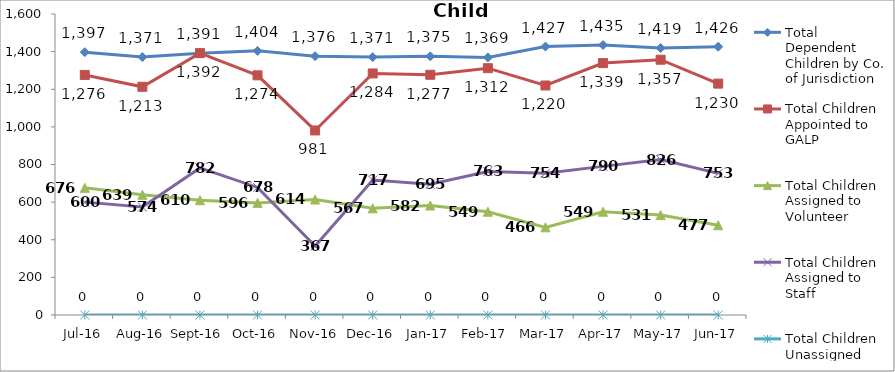
| Category | Total Dependent Children by Co. of Jurisdiction | Total Children Appointed to GALP | Total Children Assigned to Volunteer | Total Children Assigned to Staff | Total Children Unassigned |
|---|---|---|---|---|---|
| Jul-16 | 1397 | 1276 | 676 | 600 | 0 |
| Aug-16 | 1371 | 1213 | 639 | 574 | 0 |
| Sep-16 | 1391 | 1392 | 610 | 782 | 0 |
| Oct-16 | 1404 | 1274 | 596 | 678 | 0 |
| Nov-16 | 1376 | 981 | 614 | 367 | 0 |
| Dec-16 | 1371 | 1284 | 567 | 717 | 0 |
| Jan-17 | 1375 | 1277 | 582 | 695 | 0 |
| Feb-17 | 1369 | 1312 | 549 | 763 | 0 |
| Mar-17 | 1427 | 1220 | 466 | 754 | 0 |
| Apr-17 | 1435 | 1339 | 549 | 790 | 0 |
| May-17 | 1419 | 1357 | 531 | 826 | 0 |
| Jun-17 | 1426 | 1230 | 477 | 753 | 0 |